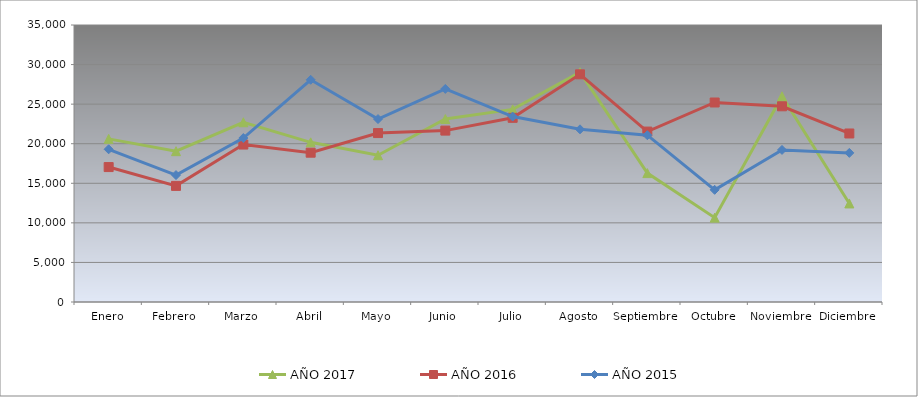
| Category | AÑO 2017 | AÑO 2016 | AÑO 2015 |
|---|---|---|---|
| Enero | 20611.526 | 17049.263 | 19294.657 |
| Febrero | 19059.556 | 14670.998 | 16037.863 |
| Marzo | 22711.678 | 19893.825 | 20716.957 |
| Abril | 20176.333 | 18864.652 | 28077.584 |
| Mayo | 18543.448 | 21344.778 | 23116.144 |
| Junio | 23121.357 | 21656.397 | 26924.042 |
| Julio | 24338.002 | 23272.591 | 23430.197 |
| Agosto | 29027.443 | 28768.556 | 21819.164 |
| Septiembre | 16287.297 | 21534.164 | 21076.307 |
| Octubre | 10659.676 | 25209.458 | 14173.171 |
| Noviembre | 25991.298 | 24728.071 | 19213.879 |
| Diciembre | 12452.205 | 21292.715 | 18840.186 |